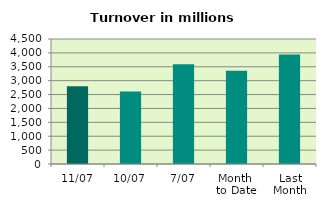
| Category | Series 0 |
|---|---|
| 11/07 | 2795.842 |
| 10/07 | 2613.245 |
| 7/07 | 3589.911 |
| Month 
to Date | 3352.545 |
| Last
Month | 3940.311 |